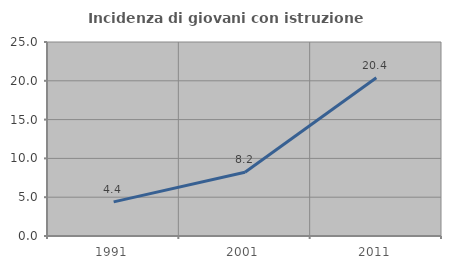
| Category | Incidenza di giovani con istruzione universitaria |
|---|---|
| 1991.0 | 4.397 |
| 2001.0 | 8.215 |
| 2011.0 | 20.386 |